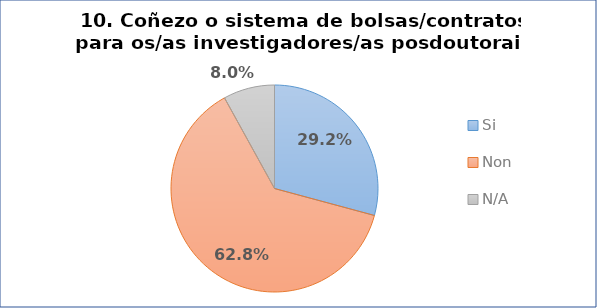
| Category | Pregunta 10. Coñezo o sistema de bolsas/contratos para os/as investigadores/as posdoutorais |
|---|---|
| Si | 0.292 |
| Non | 0.628 |
| N/A | 0.08 |